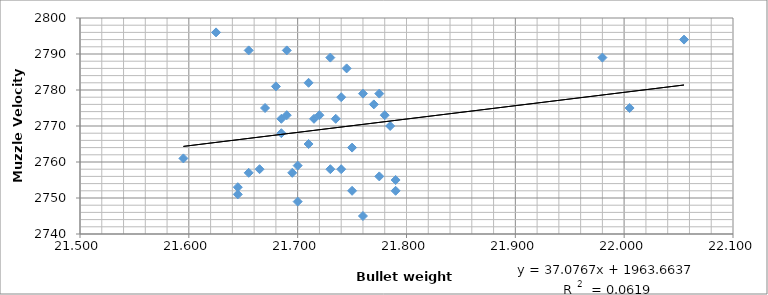
| Category | 2779 |
|---|---|
| 21.76 | 2779 |
| 21.695 | 2756 |
| 21.79 | 2749 |
| 21.75 | 2752 |
| 21.725 | 2758 |
| 21.815 | 2779 |
| 22.005 | 2776 |
| 21.685 | 2761 |
| 21.755 | 2758 |
| 21.985 | 2789 |
| 21.69 | 2775 |
| 21.8 | 2781 |
| 21.745 | 2753 |
| 21.72 | 2751 |
| 21.655 | 2759 |
| 21.685 | 2757 |
| 21.62 | 2789 |
| 22.0 | 2796 |
| 21.69 | 2755 |
| 21.765 | 2794 |
| 21.715 | 2758 |
| 21.79 | 2786 |
| 21.735 | 2757 |
| 21.775 | 2773 |
| 21.715 | 2764 |
| 21.66 | 2752 |
| 21.81 | 2782 |
| 21.63 | 2768 |
| 21.66 | 2778 |
| 21.645 | 2770 |
| 21.755 | 2775 |
| 21.73 | 2745 |
| 21.675 | 2773 |
| 21.71 | 2772 |
| 21.775 | 2772 |
| 21.765 | 2791 |
| 21.775 | 2772 |
| 21.76 | 2791 |
| 21.705 | 2765 |
| 21.805 | 2773 |